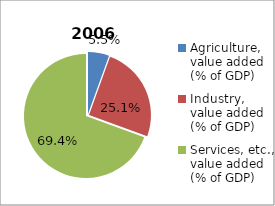
| Category | 2006 |
|---|---|
| Agriculture, value added (% of GDP)  | 5.507 |
| Industry, value added (% of GDP) | 25.072 |
| Services, etc., value added (% of GDP) | 69.42 |